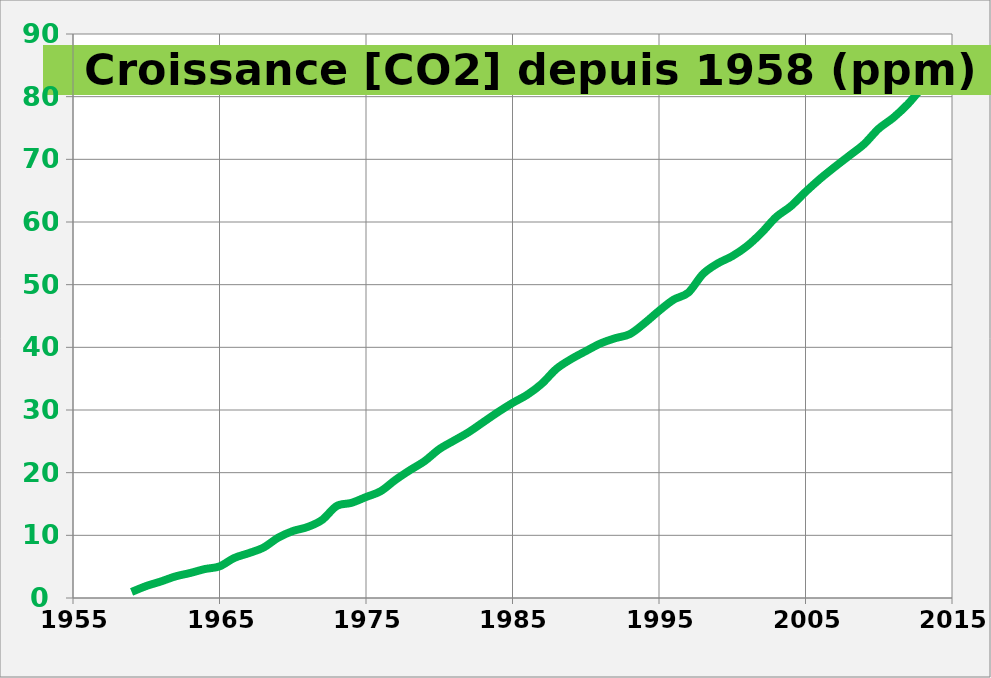
| Category |   Croissance [CO2] depuis 1958 (ppm) |
|---|---|
| 1959.0 | 0.97 |
| 1960.0 | 1.91 |
| 1961.0 | 2.64 |
| 1962.0 | 3.45 |
| 1963.0 | 3.99 |
| 1964.0 | 4.62 |
| 1965.0 | 5.04 |
| 1966.0 | 6.38 |
| 1967.0 | 7.16 |
| 1968.0 | 8.04 |
| 1969.0 | 9.62 |
| 1970.0 | 10.68 |
| 1971.0 | 11.32 |
| 1972.0 | 12.45 |
| 1973.0 | 14.68 |
| 1974.0 | 15.18 |
| 1975.0 | 16.11 |
| 1976.0 | 17.04 |
| 1977.0 | 18.83 |
| 1978.0 | 20.4 |
| 1979.0 | 21.84 |
| 1980.0 | 23.75 |
| 1981.0 | 25.11 |
| 1982.0 | 26.45 |
| 1983.0 | 28.05 |
| 1984.0 | 29.65 |
| 1985.0 | 31.12 |
| 1986.0 | 32.42 |
| 1987.0 | 34.19 |
| 1988.0 | 36.57 |
| 1989.0 | 38.12 |
| 1990.0 | 39.39 |
| 1991.0 | 40.61 |
| 1992.0 | 41.45 |
| 1993.0 | 42.1 |
| 1994.0 | 43.83 |
| 1995.0 | 45.82 |
| 1996.0 | 47.61 |
| 1997.0 | 48.73 |
| 1998.0 | 51.7 |
| 1999.0 | 53.38 |
| 2000.0 | 54.55 |
| 2001.0 | 56.14 |
| 2002.0 | 58.28 |
| 2003.0 | 60.8 |
| 2004.0 | 62.52 |
| 2005.0 | 64.8 |
| 2006.0 | 66.9 |
| 2007.0 | 68.79 |
| 2008.0 | 70.6 |
| 2009.0 | 72.43 |
| 2010.0 | 74.9 |
| 2011.0 | 76.65 |
| 2012.0 | 78.85 |
| 2013.0 | 81.52 |
| 2014.0 | 83.65 |